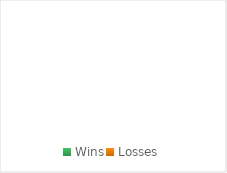
| Category | Series 0 |
|---|---|
| Wins | 0 |
| Losses | 0 |